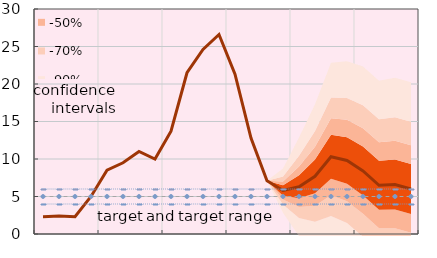
| Category | Series 8 | Series 10 | Series 11 | Series 12 |
|---|---|---|---|---|
|  | 2.3 | 4 | 5 | 6 |
|  | 2.4 | 4 | 5 | 6 |
|  | 2.3 | 4 | 5 | 6 |
| IV.20 | 5 | 4 | 5 | 6 |
|  | 8.5 | 4 | 5 | 6 |
|  | 9.5 | 4 | 5 | 6 |
|  | 11 | 4 | 5 | 6 |
| IV.21 | 10 | 4 | 5 | 6 |
|  | 13.7 | 4 | 5 | 6 |
|  | 21.5 | 4 | 5 | 6 |
|  | 24.6 | 4 | 5 | 6 |
| IV.22 | 26.6 | 4 | 5 | 6 |
|  | 21.3 | 4 | 5 | 6 |
|  | 12.8 | 4 | 5 | 6 |
|  | 7.1 | 4 | 5 | 6 |
| IV.23 | 5.8 | 4 | 5 | 6 |
|  | 6.3 | 4 | 5 | 6 |
|  | 7.7 | 4 | 5 | 6 |
|  | 10.3 | 4 | 5 | 6 |
| IV.24 | 9.8 | 4 | 5 | 6 |
|  | 8.4 | 4 | 5 | 6 |
|  | 6.5 | 4 | 5 | 6 |
|  | 6.6 | 4 | 5 | 6 |
| IV.25 | 6 | 4 | 5 | 6 |